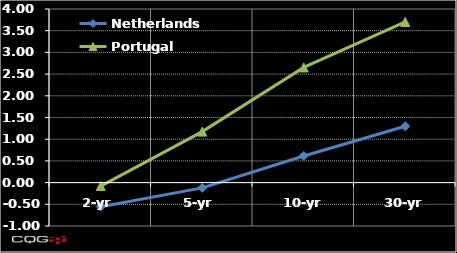
| Category | Netherlands | Portugal |
|---|---|---|
| 2-yr | -0.555 | -0.08 |
| 5-yr | -0.121 | 1.175 |
| 10-yr | 0.614 | 2.654 |
| 30-yr | 1.299 | 3.701 |